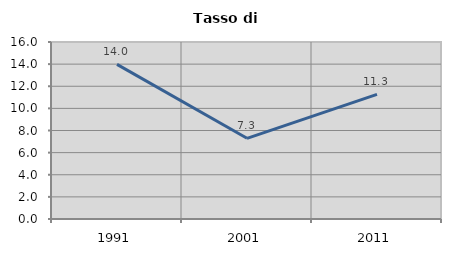
| Category | Tasso di disoccupazione   |
|---|---|
| 1991.0 | 13.974 |
| 2001.0 | 7.295 |
| 2011.0 | 11.272 |